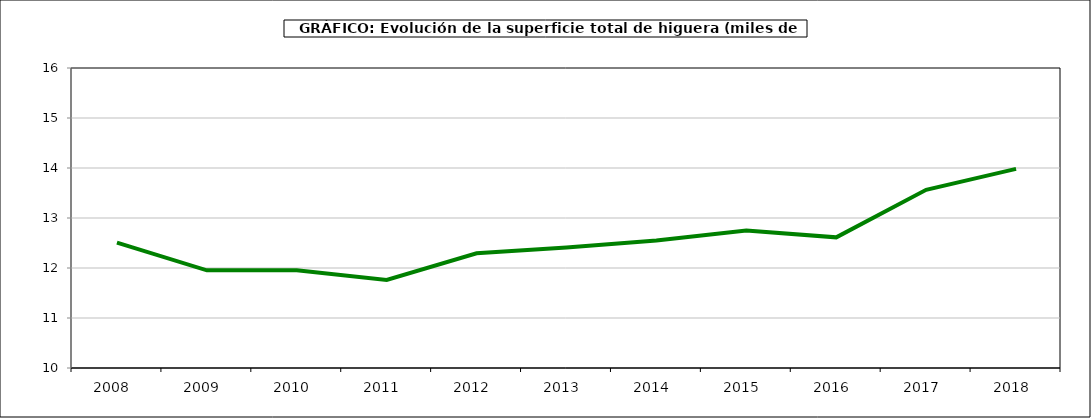
| Category | superficie higuera |
|---|---|
| 2008.0 | 12.509 |
| 2009.0 | 11.953 |
| 2010.0 | 11.953 |
| 2011.0 | 11.761 |
| 2012.0 | 12.294 |
| 2013.0 | 12.411 |
| 2014.0 | 12.549 |
| 2015.0 | 12.751 |
| 2016.0 | 12.613 |
| 2017.0 | 13.564 |
| 2018.0 | 13.983 |